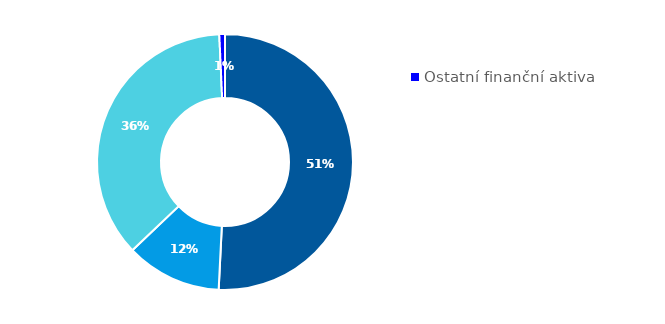
| Category | Series 0 |
|---|---|
| Hotovost | 0.508 |
| Půjčky poskytnuté nemovitostní společnosti | 0.121 |
| Majetkové účasti v nemovitostní společnosti | 0.364 |
| Ostatní finanční aktiva | 0.007 |